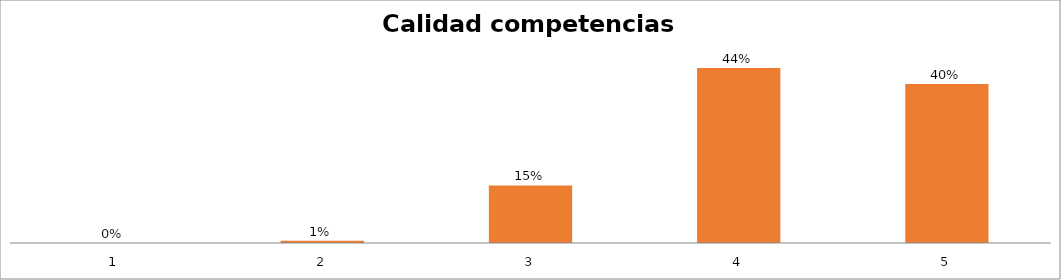
| Category | Series 1 |
|---|---|
| 0 | 0 |
| 1 | 0.006 |
| 2 | 0.146 |
| 3 | 0.444 |
| 4 | 0.404 |